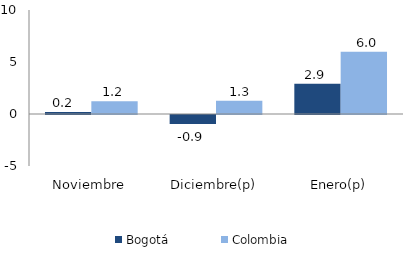
| Category | Bogotá | Colombia |
|---|---|---|
| Noviembre | 0.202 | 1.221 |
| Diciembre(p) | -0.875 | 1.264 |
| Enero(p) | 2.916 | 5.981 |